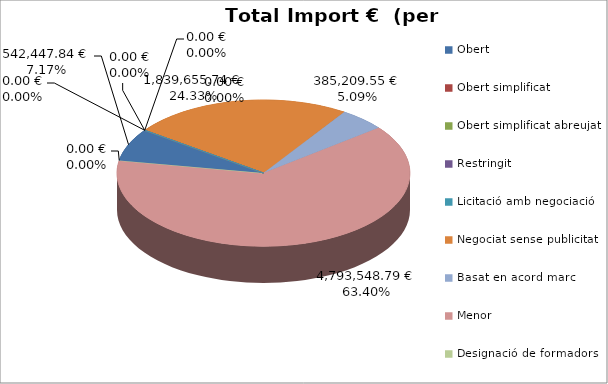
| Category | Total preu              (amb iva) |
|---|---|
| Obert | 542447.84 |
| Obert simplificat | 0 |
| Obert simplificat abreujat | 0 |
| Restringit | 0 |
| Licitació amb negociació | 0 |
| Negociat sense publicitat | 1839655.74 |
| Basat en acord marc | 385209.55 |
| Menor | 4793548.79 |
| Designació de formadors | 0 |